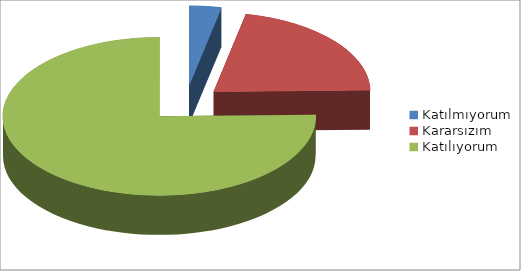
| Category | Series 0 |
|---|---|
| Katılmıyorum | 0.033 |
| Kararsızım | 0.214 |
| Katılıyorum | 0.753 |